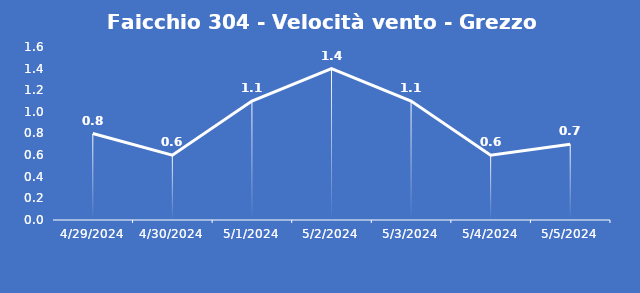
| Category | Faicchio 304 - Velocità vento - Grezzo (m/s) |
|---|---|
| 4/29/24 | 0.8 |
| 4/30/24 | 0.6 |
| 5/1/24 | 1.1 |
| 5/2/24 | 1.4 |
| 5/3/24 | 1.1 |
| 5/4/24 | 0.6 |
| 5/5/24 | 0.7 |